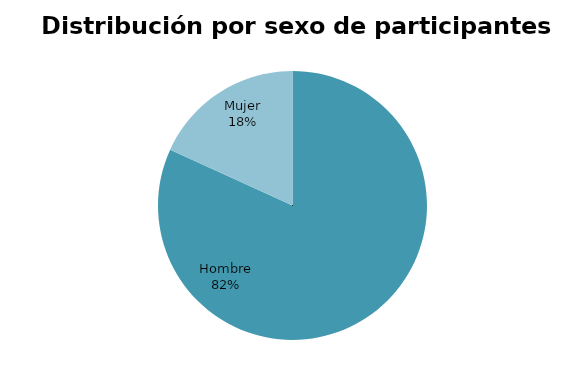
| Category | Series 0 |
|---|---|
| Hombre | 9 |
| Mujer | 2 |